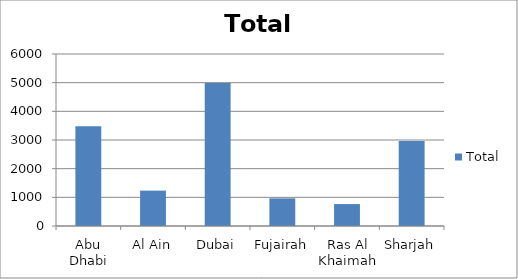
| Category | Total |
|---|---|
| Abu Dhabi | 3476 |
| Al Ain | 1234 |
| Dubai | 4987 |
| Fujairah | 965 |
| Ras Al Khaimah | 765 |
| Sharjah | 2965 |